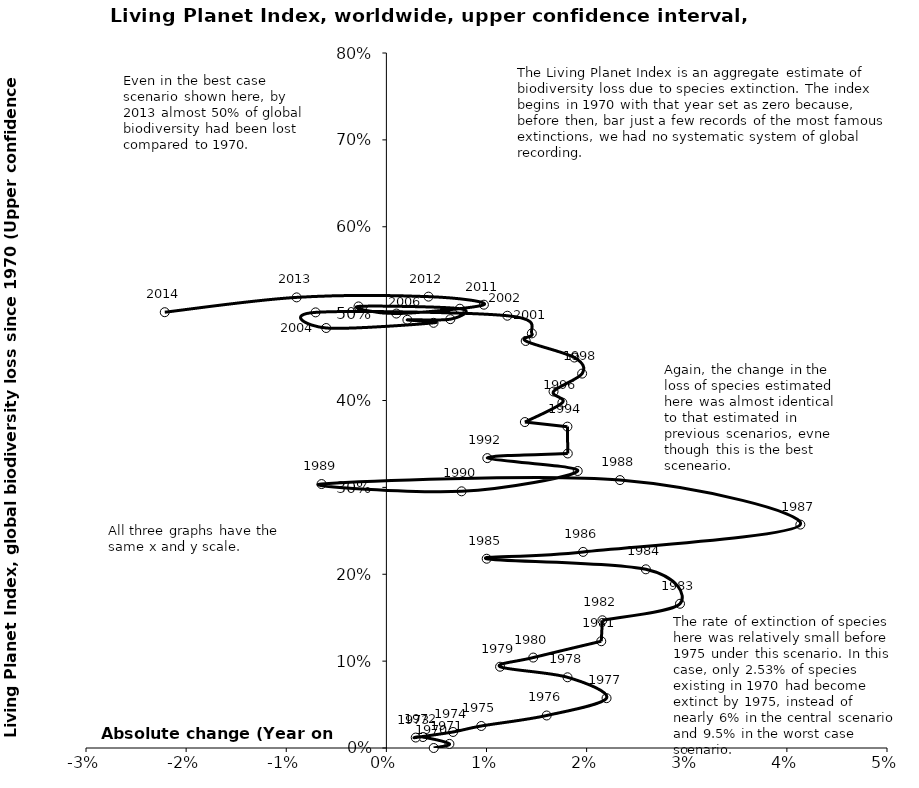
| Category | Series 0 |
|---|---|
| 0.004727992385698987 | 0 |
| 0.006297477076278979 | 0.005 |
| 0.0036467114772705256 | 0.013 |
| 0.002931079772479528 | 0.012 |
| 0.006661929796284494 | 0.018 |
| 0.009477890274715517 | 0.025 |
| 0.01601218137355298 | 0.037 |
| 0.021989920727546464 | 0.057 |
| 0.018093428805486034 | 0.081 |
| 0.011354874711755003 | 0.094 |
| 0.014667015680135953 | 0.104 |
| 0.02146283204479399 | 0.123 |
| 0.02157385838029502 | 0.147 |
| 0.029326393365405545 | 0.166 |
| 0.0259157462054575 | 0.206 |
| 0.010019290486870502 | 0.218 |
| 0.019651002186808986 | 0.226 |
| 0.041344694849417996 | 0.257 |
| 0.023331424670132495 | 0.308 |
| -0.0064715793901899965 | 0.304 |
| 0.007511234211518503 | 0.295 |
| 0.019108467218607983 | 0.319 |
| 0.010080880082270538 | 0.334 |
| 0.018117527861916505 | 0.339 |
| 0.018082188345527495 | 0.37 |
| 0.01383268576645047 | 0.375 |
| 0.017578248610951475 | 0.398 |
| 0.016695870769590004 | 0.41 |
| 0.01954998205770503 | 0.431 |
| 0.018774987640563012 | 0.449 |
| 0.013916016458370484 | 0.469 |
| 0.014528284865638508 | 0.477 |
| 0.012081706290899996 | 0.498 |
| -0.007068918319778517 | 0.501 |
| -0.006010195164387999 | 0.483 |
| 0.004712110263416502 | 0.489 |
| 0.002098053220435492 | 0.493 |
| 0.006390269437948015 | 0.494 |
| 0.00733950793839 | 0.506 |
| -0.002782137344349511 | 0.508 |
| 0.0009973428421565234 | 0.5 |
| 0.009741617182780993 | 0.51 |
| 0.004206710088107468 | 0.52 |
| -0.008963614201099979 | 0.519 |
| -0.022133938490307425 | 0.502 |